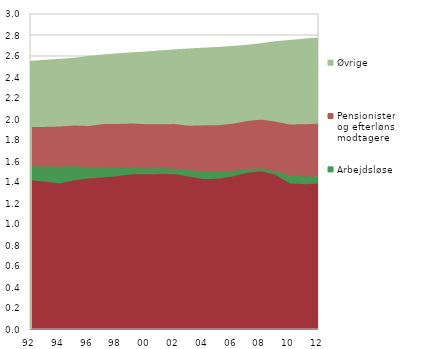
| Category | Beskæftigede | Arbejdsløse | Pensionister
og efterløns-
modtagere | Øvrige |
|---|---|---|---|---|
| 92 | 1.426 | 0.134 | 0.374 | 0.611 |
| 93 | 1.412 | 0.145 | 0.377 | 0.62 |
| 94 | 1.396 | 0.159 | 0.383 | 0.626 |
| 95 | 1.425 | 0.134 | 0.389 | 0.625 |
| 96 | 1.444 | 0.106 | 0.393 | 0.649 |
| 97 | 1.453 | 0.091 | 0.417 | 0.644 |
| 98 | 1.465 | 0.076 | 0.42 | 0.653 |
| 99 | 1.483 | 0.062 | 0.421 | 0.659 |
| 00 | 1.482 | 0.058 | 0.42 | 0.674 |
| 01 | 1.485 | 0.057 | 0.418 | 0.685 |
| 02 | 1.484 | 0.054 | 0.423 | 0.693 |
| 03 | 1.46 | 0.06 | 0.425 | 0.717 |
| 04 | 1.437 | 0.074 | 0.438 | 0.721 |
| 05 | 1.44 | 0.066 | 0.443 | 0.727 |
| 06 | 1.464 | 0.051 | 0.45 | 0.722 |
| 07 | 1.497 | 0.036 | 0.457 | 0.707 |
| 08 | 1.512 | 0.028 | 0.464 | 0.708 |
| 09 | 1.477 | 0.034 | 0.472 | 0.748 |
| 10 | 1.396 | 0.077 | 0.485 | 0.785 |
| 11 | 1.388 | 0.075 | 0.495 | 0.798 |
| 12 | 1.396 | 0.066 | 0.504 | 0.801 |